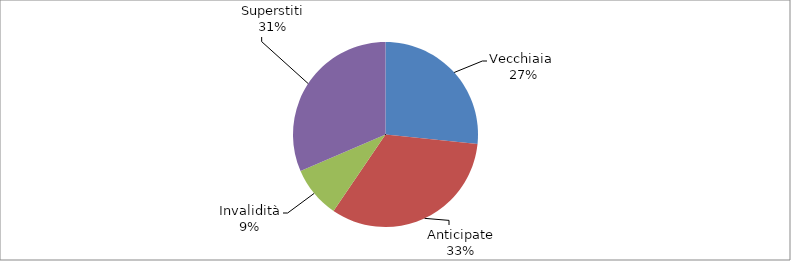
| Category | Series 0 |
|---|---|
| Vecchiaia  | 26022 |
| Anticipate | 32137 |
| Invalidità | 8828 |
| Superstiti | 30756 |